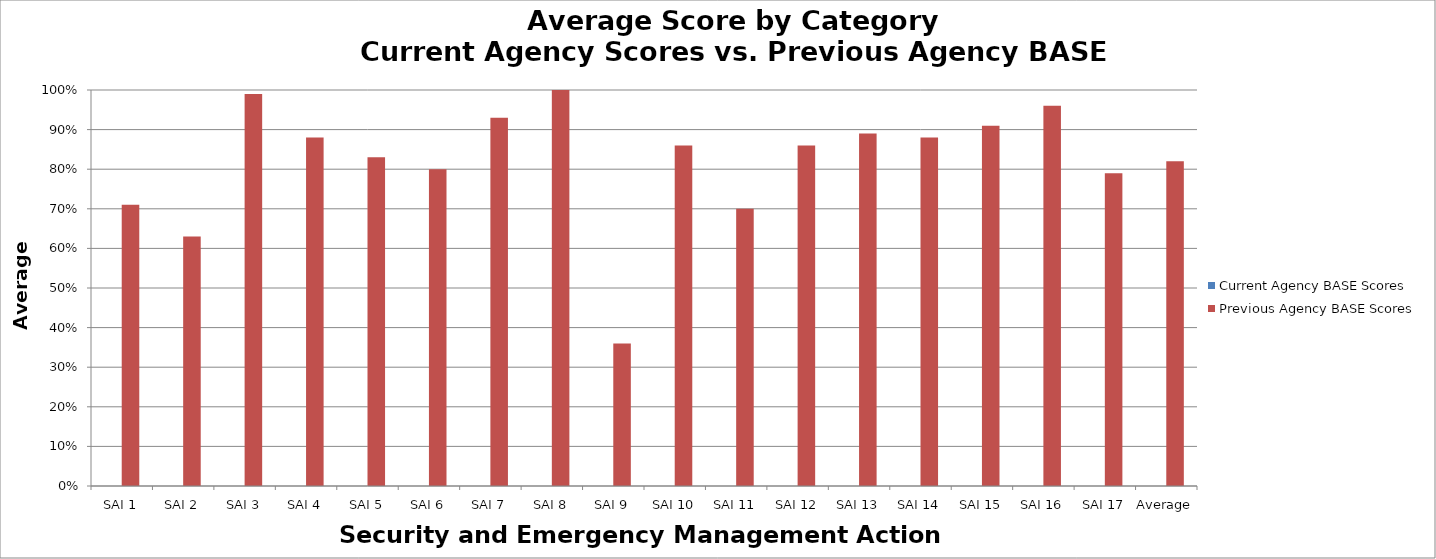
| Category | Current Agency BASE Scores | Previous Agency BASE Scores |
|---|---|---|
| SAI 1 | 0 | 0.71 |
| SAI 2 | 0 | 0.63 |
| SAI 3 | 0 | 0.99 |
| SAI 4 | 0 | 0.88 |
| SAI 5 | 0 | 0.83 |
| SAI 6 | 0 | 0.8 |
| SAI 7 | 0 | 0.93 |
| SAI 8 | 0 | 1 |
| SAI 9 | 0 | 0.36 |
| SAI 10 | 0 | 0.86 |
| SAI 11 | 0 | 0.7 |
| SAI 12 | 0 | 0.86 |
| SAI 13 | 0 | 0.89 |
| SAI 14 | 0 | 0.88 |
| SAI 15 | 0 | 0.91 |
| SAI 16 | 0 | 0.96 |
| SAI 17 | 0 | 0.79 |
| Average | 0 | 0.82 |